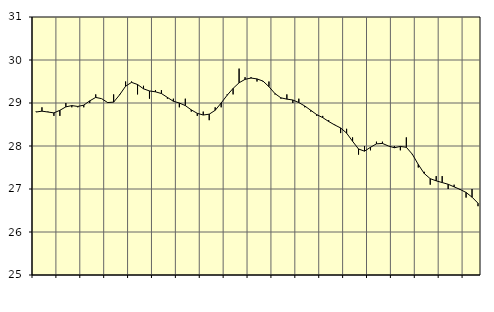
| Category | Piggar | Series 1 |
|---|---|---|
| nan | 28.8 | 28.79 |
| 1.0 | 28.9 | 28.81 |
| 1.0 | 28.8 | 28.79 |
| 1.0 | 28.7 | 28.77 |
| nan | 28.7 | 28.83 |
| 2.0 | 29 | 28.91 |
| 2.0 | 28.9 | 28.94 |
| 2.0 | 28.9 | 28.92 |
| nan | 28.9 | 28.95 |
| 3.0 | 29 | 29.05 |
| 3.0 | 29.2 | 29.13 |
| 3.0 | 29.1 | 29.1 |
| nan | 29 | 29.01 |
| 4.0 | 29.2 | 29.02 |
| 4.0 | 29.2 | 29.19 |
| 4.0 | 29.5 | 29.39 |
| nan | 29.5 | 29.48 |
| 5.0 | 29.2 | 29.43 |
| 5.0 | 29.4 | 29.33 |
| 5.0 | 29.1 | 29.28 |
| nan | 29.3 | 29.26 |
| 6.0 | 29.3 | 29.22 |
| 6.0 | 29.1 | 29.13 |
| 6.0 | 29.1 | 29.04 |
| nan | 28.9 | 29 |
| 7.0 | 29.1 | 28.94 |
| 7.0 | 28.8 | 28.84 |
| 7.0 | 28.7 | 28.76 |
| nan | 28.8 | 28.72 |
| 8.0 | 28.6 | 28.74 |
| 8.0 | 28.9 | 28.83 |
| 8.0 | 28.9 | 29 |
| nan | 29.2 | 29.18 |
| 9.0 | 29.2 | 29.34 |
| 9.0 | 29.8 | 29.47 |
| 9.0 | 29.6 | 29.55 |
| nan | 29.6 | 29.58 |
| 10.0 | 29.5 | 29.56 |
| 10.0 | 29.5 | 29.51 |
| 10.0 | 29.5 | 29.38 |
| nan | 29.2 | 29.22 |
| 11.0 | 29.1 | 29.12 |
| 11.0 | 29.2 | 29.09 |
| 11.0 | 29 | 29.07 |
| nan | 29.1 | 29.01 |
| 12.0 | 28.9 | 28.93 |
| 12.0 | 28.8 | 28.83 |
| 12.0 | 28.7 | 28.73 |
| nan | 28.7 | 28.66 |
| 13.0 | 28.6 | 28.57 |
| 13.0 | 28.5 | 28.49 |
| 13.0 | 28.3 | 28.42 |
| nan | 28.4 | 28.3 |
| 14.0 | 28.2 | 28.11 |
| 14.0 | 27.8 | 27.93 |
| 14.0 | 28 | 27.88 |
| nan | 27.9 | 27.97 |
| 15.0 | 28.1 | 28.05 |
| 15.0 | 28.1 | 28.06 |
| 15.0 | 28 | 28 |
| nan | 28 | 27.96 |
| 16.0 | 27.9 | 27.99 |
| 16.0 | 28.2 | 27.97 |
| 16.0 | 27.8 | 27.81 |
| nan | 27.5 | 27.57 |
| 17.0 | 27.4 | 27.36 |
| 17.0 | 27.1 | 27.24 |
| 17.0 | 27.3 | 27.19 |
| nan | 27.3 | 27.15 |
| 18.0 | 27 | 27.11 |
| 18.0 | 27.1 | 27.05 |
| 18.0 | 27 | 26.99 |
| nan | 26.8 | 26.92 |
| 19.0 | 27 | 26.81 |
| 19.0 | 26.6 | 26.67 |